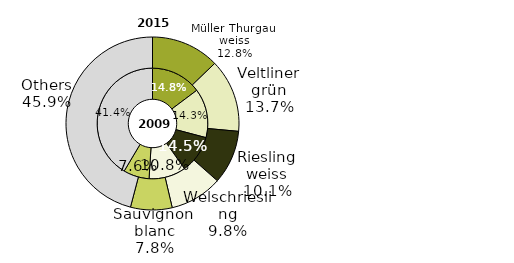
| Category | 2009 | 2015 |
|---|---|---|
| Müller Thurgau 
weiss | 1572.01 | 1554.777 |
| Veltliner grün | 1527.365 | 1664.948 |
| Riesling weiss | 1181.05 | 1225.643 |
| Welschriesling | 1148.181 | 1195.008 |
| Sauvignon 
blanc | 804.584 | 945.05 |
| Others | 4411.725 | 5586.629 |